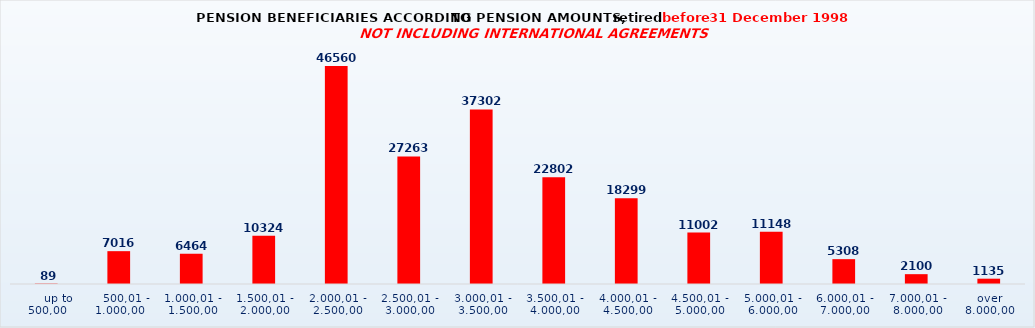
| Category | Series 0 |
|---|---|
|      up to 500,00 | 89 |
|    500,01 - 1.000,00 | 7016 |
| 1.000,01 - 1.500,00 | 6464 |
| 1.500,01 - 2.000,00 | 10324 |
| 2.000,01 - 2.500,00 | 46560 |
| 2.500,01 - 3.000,00 | 27263 |
| 3.000,01 - 3.500,00 | 37302 |
| 3.500,01 - 4.000,00 | 22802 |
| 4.000,01 - 4.500,00 | 18299 |
| 4.500,01 - 5.000,00 | 11002 |
| 5.000,01 - 6.000,00 | 11148 |
| 6.000,01 - 7.000,00 | 5308 |
| 7.000,01 - 8.000,00 | 2100 |
| over 8.000,00 | 1135 |